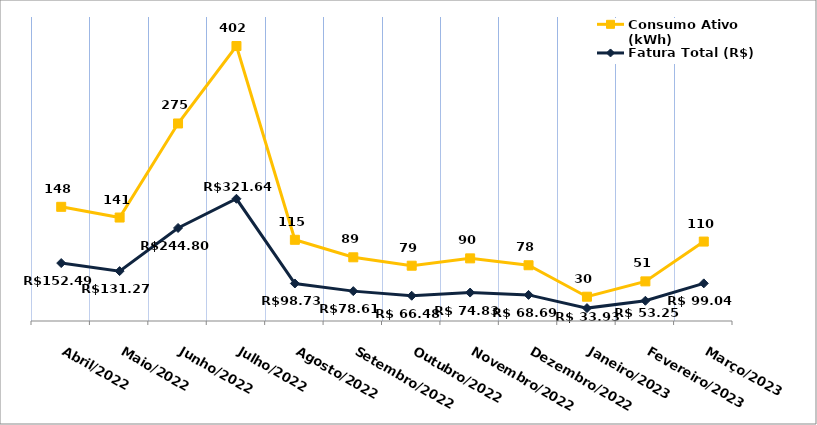
| Category | Fatura Total (R$) | Consumo Ativo (kWh) |
|---|---|---|
| Abril/2022 | 152.49 | 148 |
| Maio/2022 | 131.27 | 141 |
| Junho/2022 | 244.8 | 275 |
| Julho/2022 | 321.64 | 402 |
| Agosto/2022 | 98.73 | 115 |
| Setembro/2022 | 78.61 | 89 |
| Outubro/2022 | 66.48 | 79 |
| Novembro/2022 | 74.83 | 90 |
| Dezembro/2022 | 68.69 | 78 |
| Janeiro/2023 | 33.93 | 30 |
| Fevereiro/2023 | 53.25 | 51 |
| Março/2023 | 99.04 | 110 |